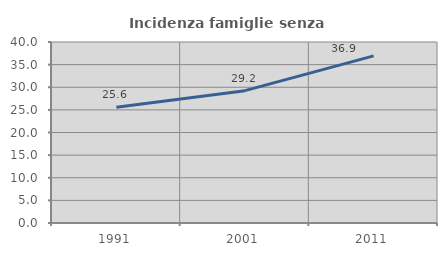
| Category | Incidenza famiglie senza nuclei |
|---|---|
| 1991.0 | 25.573 |
| 2001.0 | 29.249 |
| 2011.0 | 36.924 |